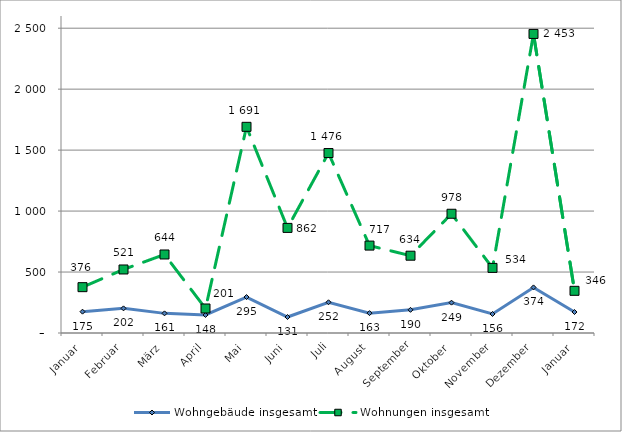
| Category | Wohngebäude insgesamt | Wohnungen insgesamt |
|---|---|---|
| Januar | 175 | 376 |
| Februar | 202 | 521 |
| März | 161 | 644 |
| April | 148 | 201 |
| Mai | 295 | 1691 |
| Juni | 131 | 862 |
| Juli | 252 | 1476 |
| August | 163 | 717 |
| September | 190 | 634 |
| Oktober | 249 | 978 |
| November | 156 | 534 |
| Dezember | 374 | 2453 |
| Januar | 172 | 346 |